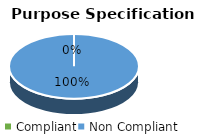
| Category | Series 2 | Series 1 | Series 0 |
|---|---|---|---|
| Compliant | 0 | 0 | 0 |
| Non Compliant | 8 | 9 | 10 |